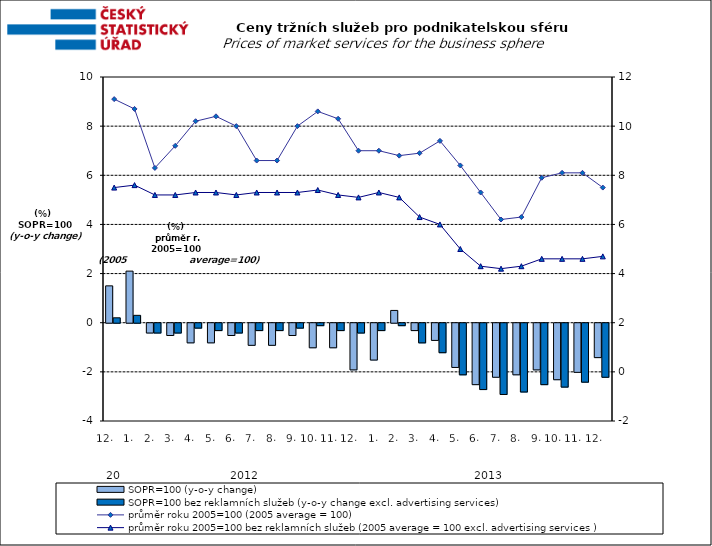
| Category | SOPR=100 (y-o-y change)   | SOPR=100 bez reklamních služeb (y-o-y change excl. advertising services)   |
|---|---|---|
| 0 | 1.5 | 0.2 |
| 1 | 2.1 | 0.3 |
| 2 | -0.4 | -0.4 |
| 3 | -0.5 | -0.4 |
| 4 | -0.8 | -0.2 |
| 5 | -0.8 | -0.3 |
| 6 | -0.5 | -0.4 |
| 7 | -0.9 | -0.3 |
| 8 | -0.9 | -0.3 |
| 9 | -0.5 | -0.2 |
| 10 | -1 | -0.1 |
| 11 | -1 | -0.3 |
| 12 | -1.9 | -0.4 |
| 13 | -1.5 | -0.3 |
| 14 | 0.5 | -0.1 |
| 15 | -0.3 | -0.8 |
| 16 | -0.7 | -1.2 |
| 17 | -1.8 | -2.1 |
| 18 | -2.5 | -2.7 |
| 19 | -2.2 | -2.9 |
| 20 | -2.1 | -2.8 |
| 21 | -1.9 | -2.5 |
| 22 | -2.3 | -2.6 |
| 23 | -2 | -2.4 |
| 24 | -1.4 | -2.2 |